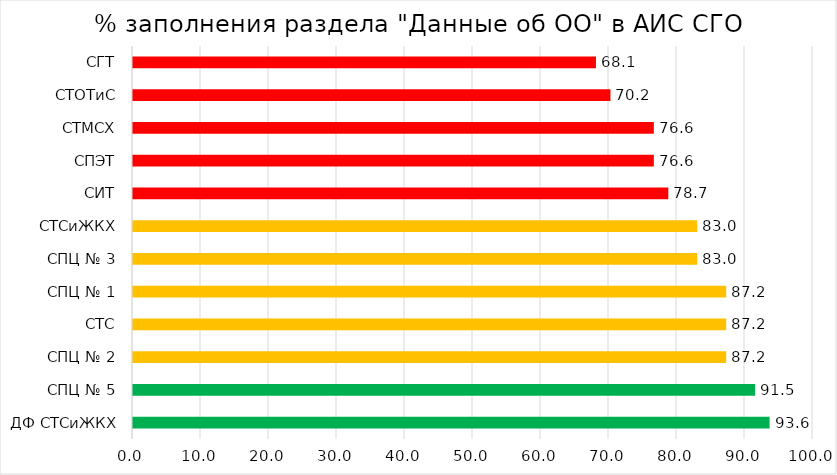
| Category | Series 0 |
|---|---|
| ДФ СТСиЖКХ | 93.617 |
| СПЦ № 5 | 91.489 |
| СПЦ № 2 | 87.234 |
| СТС | 87.234 |
| СПЦ № 1 | 87.234 |
| СПЦ № 3 | 82.979 |
| СТСиЖКХ | 82.979 |
| СИТ | 78.723 |
| СПЭТ | 76.596 |
| СТМСХ | 76.596 |
| СТОТиС | 70.213 |
| СГТ | 68.085 |